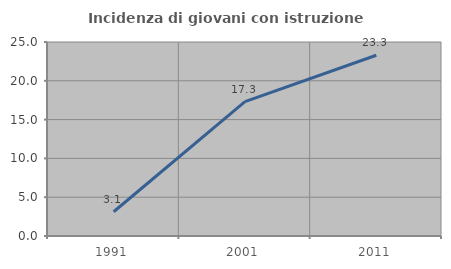
| Category | Incidenza di giovani con istruzione universitaria |
|---|---|
| 1991.0 | 3.125 |
| 2001.0 | 17.308 |
| 2011.0 | 23.288 |